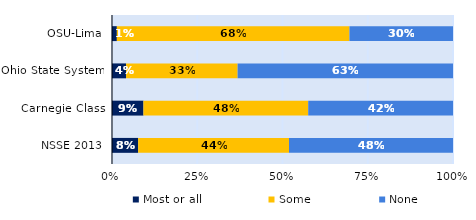
| Category | Most or all | Some | None |
|---|---|---|---|
| OSU-Lima | 0.014 | 0.682 | 0.304 |
| Ohio State System | 0.041 | 0.327 | 0.632 |
| Carnegie Class | 0.092 | 0.483 | 0.425 |
| NSSE 2013 | 0.077 | 0.442 | 0.481 |